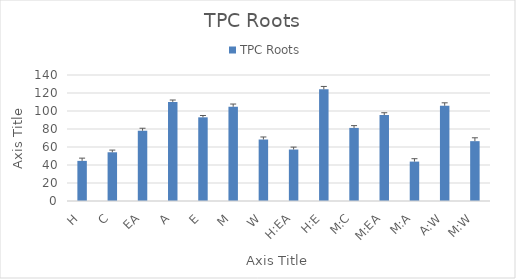
| Category | TPC Roots  |
|---|---|
| H | 44.58 |
| C | 54.133 |
| EA | 78.074 |
| A | 110.136 |
| E | 92.967 |
| M | 104.664 |
| W | 68.327 |
| H:EA | 57.181 |
| H:E | 124.039 |
| M:C | 81.205 |
| M:EA | 95.427 |
| M:A | 43.778 |
| A:W | 105.799 |
| M:W | 66.49 |